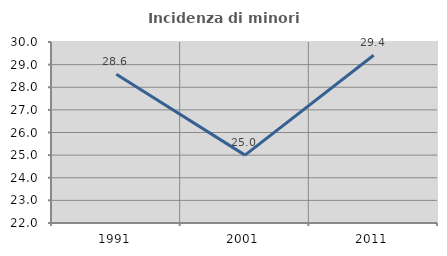
| Category | Incidenza di minori stranieri |
|---|---|
| 1991.0 | 28.571 |
| 2001.0 | 25 |
| 2011.0 | 29.412 |